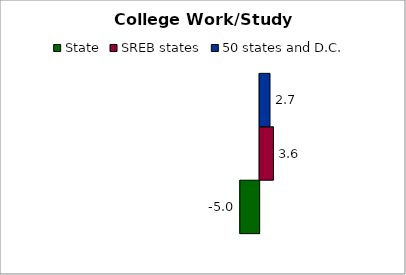
| Category | State | SREB states | 50 states and D.C. |
|---|---|---|---|
| 0 | -4.994 | 3.555 | 2.666 |